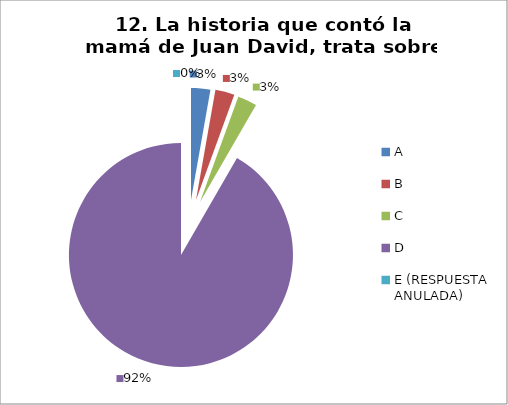
| Category | CANTIDAD DE RESPUESTAS PREGUNTA (12) | PORCENTAJE |
|---|---|---|
| A | 1 | 0.028 |
| B | 1 | 0.028 |
| C | 1 | 0.028 |
| D | 33 | 0.917 |
| E (RESPUESTA ANULADA) | 0 | 0 |